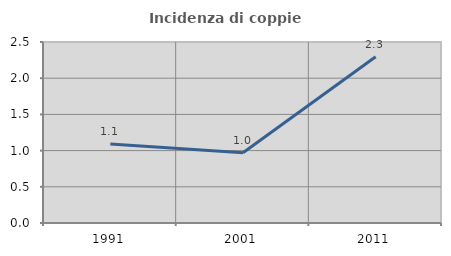
| Category | Incidenza di coppie miste |
|---|---|
| 1991.0 | 1.091 |
| 2001.0 | 0.971 |
| 2011.0 | 2.295 |